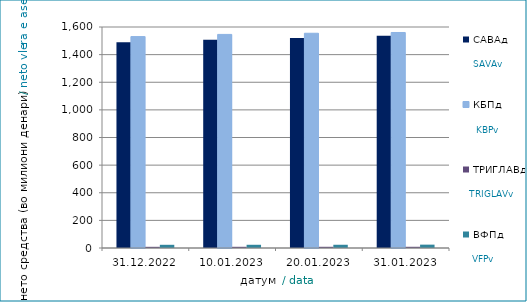
| Category | САВАд | КБПд | ТРИГЛАВд | ВФПд |
|---|---|---|---|---|
| 2022-12-31 | 1490.031 | 1530.435 | 8.55 | 23.177 |
| 2023-01-10 | 1508.544 | 1546.291 | 8.675 | 23.333 |
| 2023-01-20 | 1520.558 | 1554.696 | 8.747 | 23.469 |
| 2023-01-31 | 1536.275 | 1560.278 | 8.799 | 24.327 |